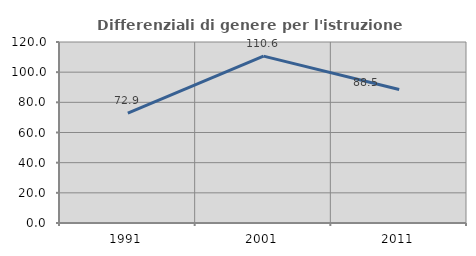
| Category | Differenziali di genere per l'istruzione superiore |
|---|---|
| 1991.0 | 72.862 |
| 2001.0 | 110.641 |
| 2011.0 | 88.507 |